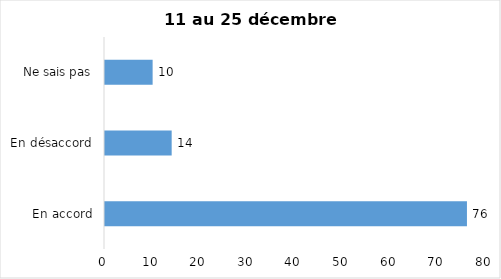
| Category | Series 0 |
|---|---|
| En accord | 76 |
| En désaccord | 14 |
| Ne sais pas | 10 |